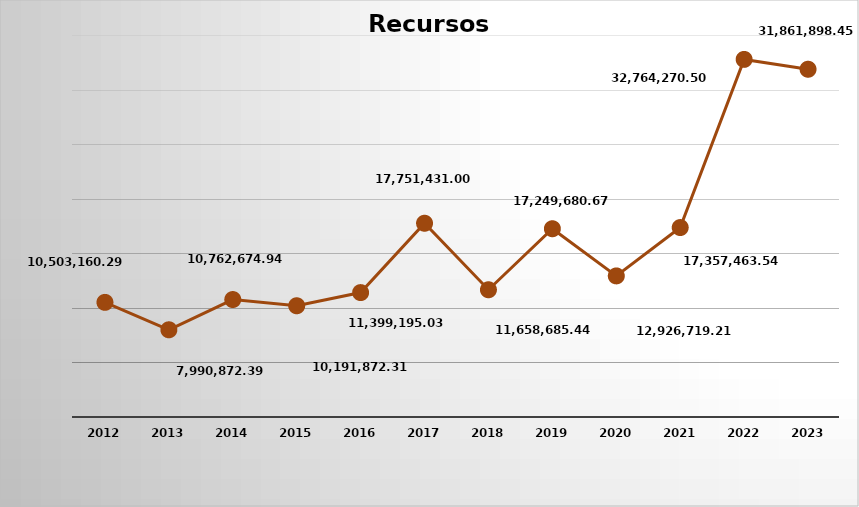
| Category | Total xeral |
|---|---|
| 2012 | 10503160.29 |
| 2013 | 7990872.39 |
| 2014 | 10762674.94 |
| 2015 | 10191872.31 |
| 2016 | 11399195.03 |
| 2017 | 17751431 |
| 2018 | 11658685.44 |
| 2019 | 17249680.67 |
| 2020 | 12926719.21 |
| 2021 | 17357463.54 |
| 2022 | 32764270.5 |
| 2023 | 31861898.45 |